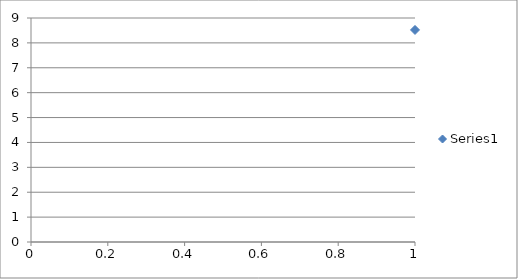
| Category | Series 0 |
|---|---|
| 0 | 8.52 |
| 1 | 8.33 |
| 2 | 7.99 |
| 3 | 7.81 |
| 4 | 7.55 |
| 5 | 7.41 |
| 6 | 7.4 |
| 7 | 7.26 |
| 8 | 7.04 |
| 9 | 6.97 |
| 10 | 6.81 |
| 11 | 6.8 |
| 12 | 6.8 |
| 13 | 6.79 |
| 14 | 6.77 |
| 15 | 6.73 |
| 16 | 6.65 |
| 17 | 6.57 |
| 18 | 6.31 |
| 19 | 6.12 |
| 20 | 5.88 |
| 21 | 5.12 |
| 22 | 5.06 |
| 23 | 4.98 |
| 24 | 4.94 |
| 25 | 4.9 |
| 26 | 4.84 |
| 27 | 4.84 |
| 28 | 4.84 |
| 29 | 4.84 |
| 30 | 4.84 |
| 31 | 4.84 |
| 32 | 4.84 |
| 33 | 4.84 |
| 34 | 4.83 |
| 35 | 4.69 |
| 36 | 4.62 |
| 37 | 4.56 |
| 38 | 4.55 |
| 39 | 4.25 |
| 40 | 4.13 |
| 41 | 3.12 |
| 42 | 0.54 |
| 43 | 0.46 |
| 44 | 0.39 |
| 45 | 0.36 |
| 46 | 0.32 |
| 47 | 0.32 |
| 48 | 0.27 |
| 49 | 0.27 |
| 50 | 0.27 |
| 51 | 0.27 |
| 52 | 0.24 |
| 53 | 0.19 |
| 54 | 0.14 |
| 55 | 0.09 |
| 56 | 0.08 |
| 57 | 0.08 |
| 58 | 0.07 |
| 59 | 0.06 |
| 60 | 0.05 |
| 61 | 0.05 |
| 62 | 0.04 |
| 63 | 0.03 |
| 64 | 0.03 |